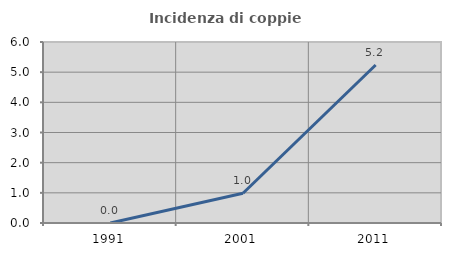
| Category | Incidenza di coppie miste |
|---|---|
| 1991.0 | 0 |
| 2001.0 | 0.985 |
| 2011.0 | 5.238 |